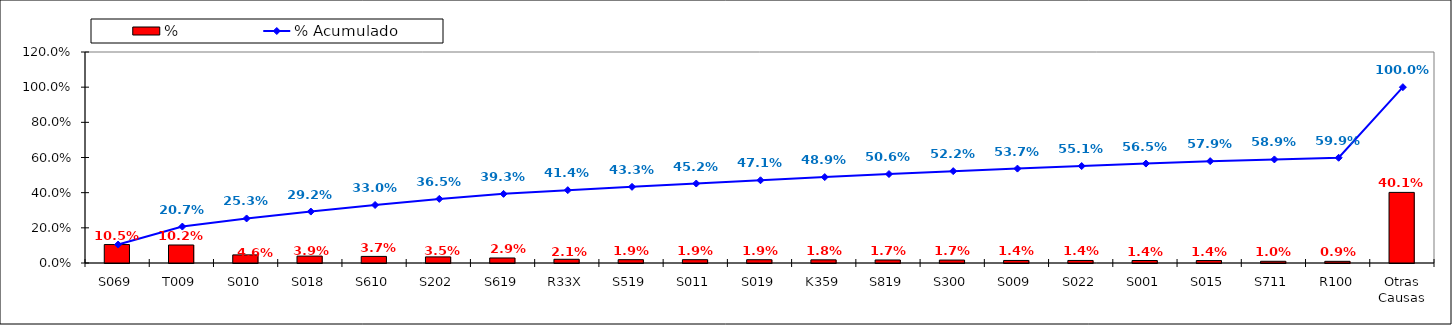
| Category | % |
|---|---|
| S069 | 0.105 |
| T009 | 0.102 |
| S010 | 0.046 |
| S018 | 0.039 |
| S610 | 0.037 |
| S202 | 0.035 |
| S619 | 0.029 |
| R33X | 0.021 |
| S519 | 0.019 |
| S011 | 0.019 |
| S019 | 0.019 |
| K359 | 0.018 |
| S819 | 0.017 |
| S300 | 0.017 |
| S009 | 0.014 |
| S022 | 0.014 |
| S001 | 0.014 |
| S015 | 0.014 |
| S711 | 0.01 |
| R100 | 0.009 |
| Otras Causas | 0.401 |